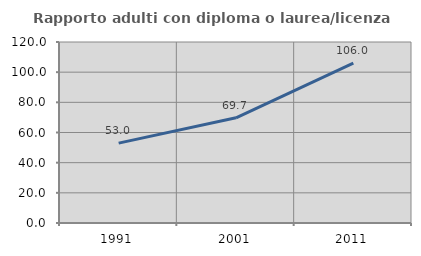
| Category | Rapporto adulti con diploma o laurea/licenza media  |
|---|---|
| 1991.0 | 52.975 |
| 2001.0 | 69.723 |
| 2011.0 | 105.952 |